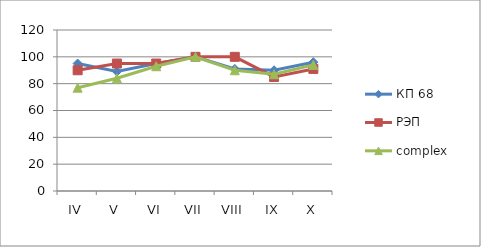
| Category | КП 68 | РЭП  | complex |
|---|---|---|---|
| IV | 95 | 90 | 77 |
| V | 89 | 95 | 84 |
| VI | 95 | 95 | 93 |
| VII | 100 | 100 | 100 |
| VIII | 91 | 100 | 90 |
| IX | 90 | 85 | 87 |
| X | 96 | 91 | 94 |